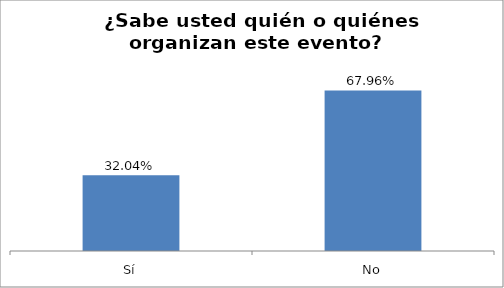
| Category | Total |
|---|---|
| Sí | 0.32 |
| No | 0.68 |